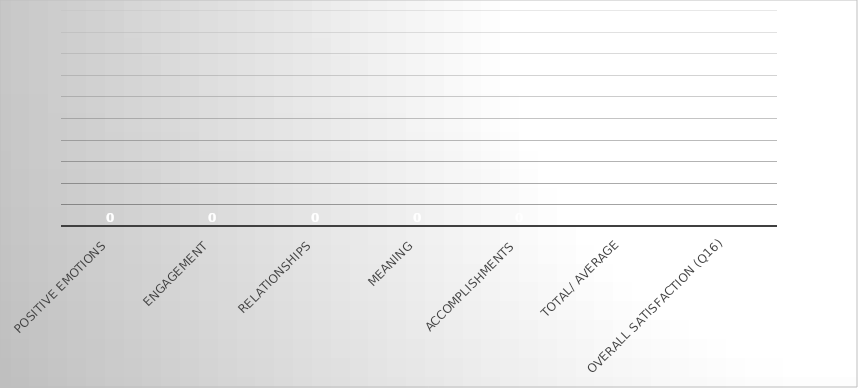
| Category | Series 1 |
|---|---|
| Positive emotions  | 0 |
| Engagement  | 0 |
| Relationships  | 0 |
| Meaning  | 0 |
| Accomplishments  | 0 |
| TOTAL/ AVERAGE | 0 |
| Overall Satisfaction (Q16) | 0 |